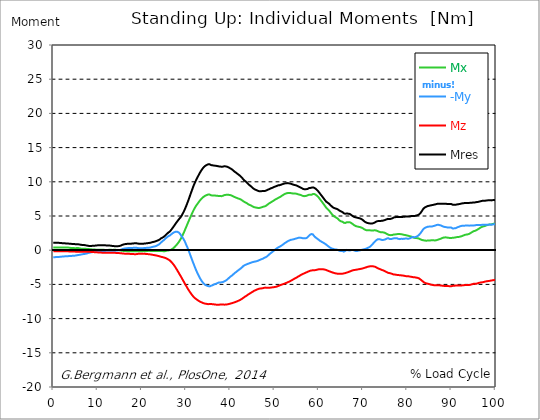
| Category |  Mx |  -My |  Mz |  Mres |
|---|---|---|---|---|
| 0.0 | 0.38 | -1.02 | -0.15 | 1.1 |
| 0.167348456675344 | 0.38 | -1.02 | -0.14 | 1.1 |
| 0.334696913350688 | 0.38 | -1.02 | -0.14 | 1.1 |
| 0.5020453700260321 | 0.4 | -1.01 | -0.15 | 1.1 |
| 0.669393826701376 | 0.41 | -1 | -0.15 | 1.1 |
| 0.83674228337672 | 0.42 | -0.99 | -0.15 | 1.09 |
| 1.0040907400520642 | 0.41 | -0.98 | -0.15 | 1.08 |
| 1.1621420602454444 | 0.39 | -0.99 | -0.15 | 1.08 |
| 1.3294905169207885 | 0.38 | -0.98 | -0.16 | 1.07 |
| 1.4968389735961325 | 0.37 | -0.97 | -0.16 | 1.06 |
| 1.6641874302714765 | 0.38 | -0.96 | -0.16 | 1.05 |
| 1.8315358869468206 | 0.39 | -0.95 | -0.16 | 1.04 |
| 1.9988843436221646 | 0.4 | -0.93 | -0.16 | 1.03 |
| 2.1662328002975086 | 0.4 | -0.92 | -0.16 | 1.02 |
| 2.333581256972853 | 0.39 | -0.92 | -0.16 | 1.01 |
| 2.5009297136481967 | 0.38 | -0.91 | -0.16 | 1 |
| 2.6682781703235405 | 0.4 | -0.89 | -0.16 | 1 |
| 2.8356266269988843 | 0.4 | -0.89 | -0.17 | 0.99 |
| 3.002975083674229 | 0.38 | -0.89 | -0.17 | 0.98 |
| 3.1703235403495724 | 0.37 | -0.88 | -0.17 | 0.98 |
| 3.337671997024917 | 0.38 | -0.87 | -0.17 | 0.97 |
| 3.4957233172182973 | 0.38 | -0.86 | -0.17 | 0.96 |
| 3.663071773893641 | 0.37 | -0.85 | -0.18 | 0.95 |
| 3.8304202305689854 | 0.34 | -0.85 | -0.19 | 0.94 |
| 3.997768687244329 | 0.31 | -0.85 | -0.19 | 0.93 |
| 4.165117143919673 | 0.32 | -0.83 | -0.19 | 0.92 |
| 4.332465600595017 | 0.33 | -0.82 | -0.19 | 0.91 |
| 4.499814057270361 | 0.33 | -0.81 | -0.2 | 0.9 |
| 4.667162513945706 | 0.31 | -0.8 | -0.2 | 0.9 |
| 4.834510970621049 | 0.3 | -0.8 | -0.21 | 0.89 |
| 5.001859427296393 | 0.29 | -0.79 | -0.21 | 0.88 |
| 5.169207883971737 | 0.29 | -0.77 | -0.21 | 0.87 |
| 5.336556340647081 | 0.32 | -0.74 | -0.22 | 0.86 |
| 5.503904797322425 | 0.31 | -0.72 | -0.23 | 0.85 |
| 5.671253253997769 | 0.31 | -0.7 | -0.23 | 0.86 |
| 5.82930457419115 | 0.29 | -0.69 | -0.24 | 0.85 |
| 5.996653030866494 | 0.26 | -0.67 | -0.24 | 0.82 |
| 6.164001487541838 | 0.24 | -0.64 | -0.23 | 0.8 |
| 6.331349944217181 | 0.22 | -0.62 | -0.23 | 0.78 |
| 6.498698400892526 | 0.22 | -0.59 | -0.23 | 0.77 |
| 6.66604685756787 | 0.22 | -0.58 | -0.23 | 0.77 |
| 6.833395314243213 | 0.22 | -0.57 | -0.23 | 0.77 |
| 7.000743770918558 | 0.22 | -0.55 | -0.23 | 0.75 |
| 7.168092227593902 | 0.22 | -0.53 | -0.23 | 0.73 |
| 7.335440684269246 | 0.2 | -0.51 | -0.23 | 0.71 |
| 7.50278914094459 | 0.19 | -0.48 | -0.23 | 0.69 |
| 7.6701375976199335 | 0.18 | -0.46 | -0.23 | 0.67 |
| 7.837486054295278 | 0.17 | -0.43 | -0.24 | 0.65 |
| 7.995537374488658 | 0.17 | -0.39 | -0.24 | 0.63 |
| 8.162885831164003 | 0.16 | -0.36 | -0.24 | 0.62 |
| 8.330234287839346 | 0.14 | -0.34 | -0.24 | 0.62 |
| 8.49758274451469 | 0.12 | -0.32 | -0.25 | 0.62 |
| 8.664931201190035 | 0.12 | -0.3 | -0.26 | 0.63 |
| 8.832279657865378 | 0.12 | -0.27 | -0.26 | 0.64 |
| 8.999628114540721 | 0.12 | -0.26 | -0.27 | 0.65 |
| 9.166976571216066 | 0.12 | -0.24 | -0.28 | 0.66 |
| 9.334325027891412 | 0.11 | -0.23 | -0.29 | 0.66 |
| 9.501673484566755 | 0.09 | -0.21 | -0.29 | 0.67 |
| 9.669021941242098 | 0.06 | -0.2 | -0.3 | 0.69 |
| 9.836370397917442 | 0.08 | -0.17 | -0.31 | 0.7 |
| 10.003718854592787 | 0.08 | -0.16 | -0.32 | 0.71 |
| 10.17106731126813 | 0.08 | -0.15 | -0.32 | 0.71 |
| 10.329118631461512 | 0.07 | -0.15 | -0.33 | 0.72 |
| 10.496467088136853 | 0.07 | -0.14 | -0.34 | 0.73 |
| 10.663815544812199 | 0.06 | -0.12 | -0.34 | 0.74 |
| 10.831164001487544 | 0.07 | -0.11 | -0.35 | 0.75 |
| 10.998512458162887 | 0.07 | -0.1 | -0.36 | 0.74 |
| 11.16586091483823 | 0.07 | -0.1 | -0.36 | 0.73 |
| 11.333209371513574 | 0.06 | -0.11 | -0.36 | 0.72 |
| 11.50055782818892 | 0.05 | -0.11 | -0.36 | 0.71 |
| 11.667906284864264 | 0.04 | -0.11 | -0.36 | 0.71 |
| 11.835254741539607 | 0.03 | -0.1 | -0.36 | 0.71 |
| 12.00260319821495 | 0.04 | -0.09 | -0.36 | 0.7 |
| 12.169951654890292 | 0.05 | -0.08 | -0.37 | 0.7 |
| 12.337300111565641 | 0.04 | -0.09 | -0.37 | 0.69 |
| 12.504648568240984 | 0.05 | -0.09 | -0.36 | 0.69 |
| 12.662699888434362 | 0.06 | -0.09 | -0.36 | 0.68 |
| 12.830048345109708 | 0.07 | -0.08 | -0.37 | 0.67 |
| 12.997396801785053 | 0.07 | -0.09 | -0.37 | 0.66 |
| 13.164745258460396 | 0.04 | -0.09 | -0.37 | 0.64 |
| 13.33209371513574 | 0.03 | -0.09 | -0.37 | 0.62 |
| 13.499442171811083 | 0.05 | -0.1 | -0.37 | 0.61 |
| 13.666790628486426 | 0.07 | -0.09 | -0.37 | 0.6 |
| 13.834139085161771 | 0.08 | -0.08 | -0.38 | 0.59 |
| 14.001487541837117 | 0.06 | -0.08 | -0.39 | 0.58 |
| 14.16883599851246 | 0.04 | -0.07 | -0.39 | 0.57 |
| 14.336184455187803 | 0.03 | -0.05 | -0.4 | 0.57 |
| 14.503532911863147 | 0.03 | -0.03 | -0.4 | 0.58 |
| 14.670881368538492 | 0.04 | -0.03 | -0.41 | 0.59 |
| 14.828932688731873 | 0.01 | -0.01 | -0.42 | 0.6 |
| 14.996281145407215 | -0.01 | 0.01 | -0.43 | 0.62 |
| 15.163629602082558 | -0.03 | 0.04 | -0.44 | 0.66 |
| 15.330978058757903 | -0.06 | 0.09 | -0.45 | 0.7 |
| 15.498326515433247 | -0.06 | 0.12 | -0.46 | 0.73 |
| 15.665674972108594 | -0.08 | 0.19 | -0.48 | 0.8 |
| 15.833023428783937 | -0.11 | 0.22 | -0.49 | 0.84 |
| 16.00037188545928 | -0.13 | 0.23 | -0.5 | 0.86 |
| 16.167720342134626 | -0.13 | 0.25 | -0.5 | 0.88 |
| 16.335068798809967 | -0.13 | 0.27 | -0.51 | 0.9 |
| 16.502417255485312 | -0.14 | 0.28 | -0.52 | 0.91 |
| 16.669765712160658 | -0.14 | 0.3 | -0.52 | 0.93 |
| 16.837114168836 | -0.14 | 0.31 | -0.53 | 0.93 |
| 17.004462625511344 | -0.16 | 0.31 | -0.53 | 0.94 |
| 17.16251394570472 | -0.16 | 0.33 | -0.53 | 0.95 |
| 17.32986240238007 | -0.14 | 0.34 | -0.54 | 0.96 |
| 17.497210859055414 | -0.15 | 0.34 | -0.55 | 0.96 |
| 17.664559315730756 | -0.16 | 0.33 | -0.55 | 0.96 |
| 17.8319077724061 | -0.17 | 0.33 | -0.55 | 0.97 |
| 17.999256229081443 | -0.17 | 0.34 | -0.56 | 0.98 |
| 18.166604685756788 | -0.16 | 0.35 | -0.57 | 0.99 |
| 18.333953142432133 | -0.17 | 0.36 | -0.58 | 1.01 |
| 18.501301599107478 | -0.17 | 0.37 | -0.59 | 1.02 |
| 18.668650055782823 | -0.17 | 0.36 | -0.58 | 1.01 |
| 18.835998512458165 | -0.17 | 0.34 | -0.57 | 1 |
| 19.00334696913351 | -0.17 | 0.33 | -0.55 | 0.99 |
| 19.170695425808855 | -0.16 | 0.31 | -0.54 | 0.97 |
| 19.338043882484197 | -0.17 | 0.29 | -0.52 | 0.95 |
| 19.496095202677576 | -0.16 | 0.29 | -0.52 | 0.95 |
| 19.66344365935292 | -0.15 | 0.29 | -0.52 | 0.94 |
| 19.830792116028263 | -0.16 | 0.29 | -0.51 | 0.94 |
| 19.998140572703612 | -0.15 | 0.29 | -0.51 | 0.95 |
| 20.165489029378953 | -0.14 | 0.29 | -0.51 | 0.95 |
| 20.3328374860543 | -0.13 | 0.3 | -0.51 | 0.95 |
| 20.500185942729644 | -0.13 | 0.32 | -0.52 | 0.96 |
| 20.667534399404985 | -0.14 | 0.33 | -0.53 | 0.98 |
| 20.83488285608033 | -0.16 | 0.33 | -0.54 | 0.98 |
| 21.002231312755672 | -0.14 | 0.34 | -0.55 | 1 |
| 21.16957976943102 | -0.12 | 0.35 | -0.56 | 1.02 |
| 21.336928226106362 | -0.11 | 0.36 | -0.57 | 1.03 |
| 21.504276682781704 | -0.1 | 0.36 | -0.58 | 1.05 |
| 21.67162513945705 | -0.09 | 0.37 | -0.59 | 1.06 |
| 21.82967645965043 | -0.11 | 0.38 | -0.61 | 1.08 |
| 21.997024916325774 | -0.12 | 0.4 | -0.62 | 1.1 |
| 22.16437337300112 | -0.12 | 0.44 | -0.64 | 1.14 |
| 22.33172182967646 | -0.1 | 0.47 | -0.66 | 1.17 |
| 22.499070286351806 | -0.09 | 0.5 | -0.68 | 1.2 |
| 22.666418743027148 | -0.1 | 0.52 | -0.7 | 1.22 |
| 22.833767199702496 | -0.1 | 0.54 | -0.72 | 1.25 |
| 23.00111565637784 | -0.1 | 0.56 | -0.74 | 1.27 |
| 23.168464113053183 | -0.11 | 0.6 | -0.76 | 1.32 |
| 23.335812569728528 | -0.1 | 0.65 | -0.78 | 1.36 |
| 23.50316102640387 | -0.1 | 0.7 | -0.81 | 1.4 |
| 23.670509483079215 | -0.1 | 0.77 | -0.84 | 1.44 |
| 23.83785793975456 | -0.11 | 0.81 | -0.86 | 1.47 |
| 23.995909259947936 | -0.13 | 0.9 | -0.89 | 1.54 |
| 24.163257716623285 | -0.13 | 1 | -0.92 | 1.62 |
| 24.330606173298627 | -0.13 | 1.12 | -0.96 | 1.73 |
| 24.49795462997397 | -0.12 | 1.21 | -0.99 | 1.79 |
| 24.665303086649313 | -0.13 | 1.31 | -1.01 | 1.84 |
| 24.83265154332466 | -0.15 | 1.41 | -1.04 | 1.92 |
| 25.0 | -0.16 | 1.49 | -1.07 | 1.98 |
| 25.167348456675345 | -0.16 | 1.6 | -1.11 | 2.08 |
| 25.334696913350694 | -0.13 | 1.69 | -1.14 | 2.16 |
| 25.502045370026035 | -0.1 | 1.79 | -1.18 | 2.27 |
| 25.669393826701377 | -0.07 | 1.89 | -1.23 | 2.38 |
| 25.836742283376722 | -0.06 | 1.97 | -1.29 | 2.47 |
| 26.004090740052067 | -0.04 | 2.05 | -1.36 | 2.58 |
| 26.17143919672741 | -0.03 | 2.11 | -1.43 | 2.66 |
| 26.329490516920792 | -0.01 | 2.15 | -1.5 | 2.73 |
| 26.49683897359613 | 0.03 | 2.23 | -1.6 | 2.85 |
| 26.66418743027148 | 0.09 | 2.33 | -1.71 | 2.99 |
| 26.831535886946828 | 0.15 | 2.42 | -1.83 | 3.13 |
| 26.998884343622166 | 0.23 | 2.5 | -1.96 | 3.29 |
| 27.166232800297514 | 0.31 | 2.58 | -2.1 | 3.44 |
| 27.333581256972852 | 0.41 | 2.62 | -2.24 | 3.59 |
| 27.5009297136482 | 0.52 | 2.68 | -2.4 | 3.75 |
| 27.668278170323543 | 0.64 | 2.71 | -2.58 | 3.91 |
| 27.835626626998888 | 0.76 | 2.72 | -2.75 | 4.05 |
| 28.002975083674233 | 0.89 | 2.71 | -2.92 | 4.19 |
| 28.170323540349575 | 1.02 | 2.65 | -3.11 | 4.34 |
| 28.33767199702492 | 1.17 | 2.59 | -3.29 | 4.48 |
| 28.50502045370026 | 1.34 | 2.49 | -3.48 | 4.62 |
| 28.663071773893645 | 1.51 | 2.37 | -3.66 | 4.75 |
| 28.830420230568986 | 1.69 | 2.21 | -3.84 | 4.87 |
| 28.99776868724433 | 1.89 | 2.04 | -4.03 | 5.03 |
| 29.165117143919673 | 2.11 | 1.91 | -4.23 | 5.25 |
| 29.33246560059502 | 2.35 | 1.74 | -4.43 | 5.45 |
| 29.499814057270367 | 2.58 | 1.54 | -4.61 | 5.66 |
| 29.66716251394571 | 2.82 | 1.35 | -4.81 | 5.89 |
| 29.834510970621054 | 3.09 | 1.12 | -5.01 | 6.15 |
| 30.00185942729639 | 3.34 | 0.85 | -5.19 | 6.4 |
| 30.169207883971744 | 3.6 | 0.61 | -5.37 | 6.68 |
| 30.33655634064708 | 3.86 | 0.36 | -5.56 | 6.97 |
| 30.50390479732243 | 4.11 | 0.09 | -5.74 | 7.25 |
| 30.671253253997772 | 4.36 | -0.18 | -5.91 | 7.55 |
| 30.829304574191156 | 4.61 | -0.48 | -6.07 | 7.86 |
| 30.996653030866494 | 4.86 | -0.78 | -6.23 | 8.17 |
| 31.164001487541842 | 5.1 | -1.07 | -6.38 | 8.47 |
| 31.331349944217187 | 5.35 | -1.36 | -6.53 | 8.77 |
| 31.498698400892525 | 5.58 | -1.65 | -6.67 | 9.07 |
| 31.666046857567874 | 5.8 | -1.93 | -6.79 | 9.36 |
| 31.833395314243212 | 6.01 | -2.2 | -6.9 | 9.62 |
| 32.00074377091856 | 6.21 | -2.48 | -7 | 9.87 |
| 32.1680922275939 | 6.39 | -2.75 | -7.09 | 10.1 |
| 32.33544068426925 | 6.55 | -3 | -7.17 | 10.32 |
| 32.50278914094459 | 6.69 | -3.25 | -7.25 | 10.54 |
| 32.670137597619934 | 6.85 | -3.48 | -7.32 | 10.75 |
| 32.83748605429528 | 7 | -3.7 | -7.39 | 10.96 |
| 33.004834510970625 | 7.15 | -3.9 | -7.46 | 11.16 |
| 33.162885831164004 | 7.29 | -4.1 | -7.52 | 11.36 |
| 33.33023428783935 | 7.41 | -4.3 | -7.57 | 11.54 |
| 33.497582744514695 | 7.53 | -4.47 | -7.62 | 11.71 |
| 33.664931201190036 | 7.64 | -4.62 | -7.67 | 11.87 |
| 33.83227965786538 | 7.73 | -4.76 | -7.72 | 12.01 |
| 33.99962811454073 | 7.82 | -4.88 | -7.76 | 12.14 |
| 34.16697657121607 | 7.9 | -4.97 | -7.78 | 12.24 |
| 34.33432502789141 | 7.96 | -5.07 | -7.81 | 12.33 |
| 34.50167348456676 | 8.02 | -5.14 | -7.83 | 12.41 |
| 34.6690219412421 | 8.06 | -5.17 | -7.85 | 12.46 |
| 34.83637039791744 | 8.11 | -5.2 | -7.88 | 12.52 |
| 35.00371885459279 | 8.14 | -5.25 | -7.89 | 12.56 |
| 35.17106731126814 | 8.15 | -5.27 | -7.89 | 12.58 |
| 35.338415767943474 | 8.13 | -5.29 | -7.86 | 12.56 |
| 35.49646708813686 | 8.08 | -5.25 | -7.85 | 12.5 |
| 35.6638155448122 | 8.03 | -5.19 | -7.86 | 12.44 |
| 35.831164001487544 | 7.98 | -5.12 | -7.89 | 12.4 |
| 35.998512458162885 | 7.98 | -5.12 | -7.9 | 12.41 |
| 36.165860914838234 | 7.97 | -5.08 | -7.91 | 12.39 |
| 36.333209371513576 | 7.98 | -5.01 | -7.92 | 12.37 |
| 36.50055782818892 | 7.98 | -4.96 | -7.93 | 12.35 |
| 36.667906284864266 | 7.98 | -4.93 | -7.95 | 12.35 |
| 36.83525474153961 | 7.97 | -4.89 | -7.96 | 12.33 |
| 37.002603198214956 | 7.96 | -4.84 | -7.97 | 12.31 |
| 37.1699516548903 | 7.95 | -4.78 | -7.99 | 12.29 |
| 37.337300111565646 | 7.93 | -4.74 | -7.99 | 12.26 |
| 37.50464856824098 | 7.91 | -4.74 | -7.97 | 12.25 |
| 37.66269988843437 | 7.92 | -4.73 | -7.95 | 12.24 |
| 37.83004834510971 | 7.91 | -4.72 | -7.94 | 12.22 |
| 37.99739680178505 | 7.9 | -4.69 | -7.93 | 12.2 |
| 38.16474525846039 | 7.92 | -4.67 | -7.94 | 12.2 |
| 38.33209371513574 | 7.96 | -4.65 | -7.95 | 12.22 |
| 38.49944217181109 | 8 | -4.6 | -7.95 | 12.24 |
| 38.666790628486424 | 8.05 | -4.55 | -7.96 | 12.27 |
| 38.83413908516178 | 8.08 | -4.5 | -7.96 | 12.28 |
| 39.001487541837115 | 8.09 | -4.44 | -7.95 | 12.25 |
| 39.16883599851246 | 8.11 | -4.36 | -7.94 | 12.23 |
| 39.336184455187805 | 8.11 | -4.27 | -7.92 | 12.19 |
| 39.503532911863154 | 8.09 | -4.18 | -7.9 | 12.14 |
| 39.670881368538495 | 8.09 | -4.08 | -7.87 | 12.09 |
| 39.83822982521384 | 8.09 | -3.97 | -7.84 | 12.04 |
| 39.996281145407224 | 8.06 | -3.87 | -7.81 | 11.96 |
| 40.163629602082565 | 8.02 | -3.8 | -7.78 | 11.9 |
| 40.33097805875791 | 7.98 | -3.73 | -7.75 | 11.84 |
| 40.498326515433256 | 7.91 | -3.64 | -7.73 | 11.74 |
| 40.6656749721086 | 7.87 | -3.54 | -7.69 | 11.66 |
| 40.83302342878393 | 7.82 | -3.44 | -7.65 | 11.57 |
| 41.00037188545929 | 7.77 | -3.34 | -7.61 | 11.47 |
| 41.16772034213463 | 7.73 | -3.26 | -7.58 | 11.4 |
| 41.33506879880997 | 7.68 | -3.19 | -7.53 | 11.32 |
| 41.50241725548531 | 7.64 | -3.11 | -7.48 | 11.24 |
| 41.66976571216066 | 7.59 | -3.01 | -7.44 | 11.15 |
| 41.837114168836 | 7.54 | -2.94 | -7.39 | 11.07 |
| 42.004462625511344 | 7.52 | -2.85 | -7.34 | 10.99 |
| 42.17181108218669 | 7.47 | -2.77 | -7.28 | 10.9 |
| 42.32986240238007 | 7.43 | -2.68 | -7.23 | 10.81 |
| 42.497210859055414 | 7.37 | -2.59 | -7.17 | 10.71 |
| 42.66455931573076 | 7.3 | -2.5 | -7.1 | 10.59 |
| 42.831907772406105 | 7.21 | -2.39 | -7.02 | 10.44 |
| 42.999256229081446 | 7.13 | -2.29 | -6.94 | 10.31 |
| 43.16660468575679 | 7.07 | -2.22 | -6.86 | 10.2 |
| 43.33395314243214 | 7.01 | -2.17 | -6.79 | 10.11 |
| 43.50130159910748 | 6.96 | -2.13 | -6.73 | 10.04 |
| 43.66865005578282 | 6.91 | -2.07 | -6.66 | 9.94 |
| 43.83599851245817 | 6.83 | -2.04 | -6.58 | 9.83 |
| 44.00334696913351 | 6.75 | -1.99 | -6.5 | 9.71 |
| 44.17069542580886 | 6.69 | -1.95 | -6.43 | 9.61 |
| 44.3380438824842 | 6.63 | -1.91 | -6.37 | 9.52 |
| 44.49609520267758 | 6.59 | -1.87 | -6.3 | 9.43 |
| 44.66344365935292 | 6.54 | -1.83 | -6.23 | 9.35 |
| 44.83079211602827 | 6.49 | -1.78 | -6.17 | 9.26 |
| 44.99814057270361 | 6.42 | -1.75 | -6.1 | 9.15 |
| 45.16548902937895 | 6.35 | -1.73 | -6.02 | 9.05 |
| 45.332837486054295 | 6.3 | -1.7 | -5.96 | 8.97 |
| 45.500185942729644 | 6.26 | -1.67 | -5.91 | 8.9 |
| 45.66753439940499 | 6.25 | -1.65 | -5.86 | 8.86 |
| 45.83488285608033 | 6.23 | -1.63 | -5.8 | 8.81 |
| 46.00223131275568 | 6.21 | -1.6 | -5.76 | 8.76 |
| 46.16957976943102 | 6.18 | -1.56 | -5.71 | 8.7 |
| 46.336928226106366 | 6.17 | -1.52 | -5.67 | 8.66 |
| 46.50427668278171 | 6.17 | -1.47 | -5.64 | 8.63 |
| 46.671625139457056 | 6.19 | -1.42 | -5.61 | 8.62 |
| 46.829676459650436 | 6.22 | -1.38 | -5.6 | 8.62 |
| 46.99702491632577 | 6.25 | -1.33 | -5.59 | 8.63 |
| 47.16437337300112 | 6.29 | -1.29 | -5.58 | 8.64 |
| 47.33172182967646 | 6.33 | -1.25 | -5.56 | 8.65 |
| 47.49907028635181 | 6.36 | -1.19 | -5.54 | 8.65 |
| 47.66641874302716 | 6.39 | -1.13 | -5.5 | 8.65 |
| 47.83376719970249 | 6.42 | -1.09 | -5.48 | 8.66 |
| 48.001115656377834 | 6.46 | -1.03 | -5.47 | 8.68 |
| 48.16846411305319 | 6.54 | -0.97 | -5.47 | 8.73 |
| 48.33581256972853 | 6.62 | -0.9 | -5.48 | 8.78 |
| 48.50316102640387 | 6.71 | -0.8 | -5.49 | 8.84 |
| 48.67050948307921 | 6.79 | -0.7 | -5.49 | 8.89 |
| 48.837857939754564 | 6.86 | -0.6 | -5.48 | 8.94 |
| 49.005206396429905 | 6.93 | -0.5 | -5.48 | 8.98 |
| 49.163257716623285 | 7 | -0.41 | -5.47 | 9.04 |
| 49.33060617329863 | 7.06 | -0.34 | -5.45 | 9.08 |
| 49.49795462997397 | 7.12 | -0.26 | -5.44 | 9.12 |
| 49.66530308664932 | 7.19 | -0.17 | -5.42 | 9.17 |
| 49.832651543324666 | 7.26 | -0.09 | -5.4 | 9.22 |
| 50.0 | 7.33 | 0 | -5.39 | 9.26 |
| 50.16734845667534 | 7.4 | 0.09 | -5.37 | 9.31 |
| 50.33469691335069 | 7.47 | 0.18 | -5.35 | 9.36 |
| 50.50204537002604 | 7.52 | 0.27 | -5.32 | 9.39 |
| 50.66939382670139 | 7.58 | 0.34 | -5.28 | 9.44 |
| 50.836742283376715 | 7.64 | 0.41 | -5.24 | 9.48 |
| 51.00409074005207 | 7.7 | 0.47 | -5.19 | 9.49 |
| 51.17143919672741 | 7.75 | 0.52 | -5.14 | 9.51 |
| 51.32949051692079 | 7.81 | 0.57 | -5.1 | 9.54 |
| 51.496838973596134 | 7.89 | 0.63 | -5.06 | 9.58 |
| 51.66418743027148 | 7.96 | 0.71 | -5.02 | 9.62 |
| 51.831535886946824 | 8.03 | 0.78 | -4.99 | 9.66 |
| 51.99888434362217 | 8.1 | 0.87 | -4.95 | 9.7 |
| 52.16623280029752 | 8.16 | 0.96 | -4.91 | 9.73 |
| 52.33358125697285 | 8.22 | 1.04 | -4.87 | 9.76 |
| 52.5009297136482 | 8.27 | 1.11 | -4.82 | 9.78 |
| 52.668278170323546 | 8.31 | 1.17 | -4.78 | 9.8 |
| 52.835626626998895 | 8.34 | 1.25 | -4.73 | 9.81 |
| 53.00297508367424 | 8.36 | 1.32 | -4.69 | 9.8 |
| 53.17032354034958 | 8.36 | 1.37 | -4.64 | 9.79 |
| 53.33767199702492 | 8.37 | 1.42 | -4.59 | 9.77 |
| 53.50502045370027 | 8.36 | 1.47 | -4.54 | 9.75 |
| 53.663071773893655 | 8.35 | 1.51 | -4.48 | 9.72 |
| 53.83042023056899 | 8.34 | 1.54 | -4.42 | 9.68 |
| 53.99776868724433 | 8.31 | 1.55 | -4.36 | 9.64 |
| 54.16511714391967 | 8.3 | 1.58 | -4.3 | 9.6 |
| 54.33246560059503 | 8.28 | 1.6 | -4.23 | 9.57 |
| 54.49981405727037 | 8.28 | 1.65 | -4.17 | 9.54 |
| 54.667162513945705 | 8.28 | 1.67 | -4.11 | 9.51 |
| 54.834510970621054 | 8.28 | 1.71 | -4.06 | 9.49 |
| 55.0018594272964 | 8.26 | 1.73 | -4 | 9.45 |
| 55.169207883971744 | 8.22 | 1.76 | -3.93 | 9.4 |
| 55.336556340647086 | 8.17 | 1.8 | -3.86 | 9.34 |
| 55.50390479732243 | 8.15 | 1.82 | -3.8 | 9.29 |
| 55.671253253997776 | 8.12 | 1.84 | -3.74 | 9.24 |
| 55.83860171067312 | 8.09 | 1.84 | -3.67 | 9.19 |
| 55.9966530308665 | 8.06 | 1.82 | -3.61 | 9.14 |
| 56.16400148754184 | 8 | 1.8 | -3.55 | 9.07 |
| 56.33134994421718 | 7.95 | 1.76 | -3.5 | 8.99 |
| 56.498698400892536 | 7.92 | 1.74 | -3.44 | 8.95 |
| 56.66604685756788 | 7.9 | 1.73 | -3.4 | 8.92 |
| 56.83339531424321 | 7.9 | 1.74 | -3.35 | 8.9 |
| 57.00074377091856 | 7.92 | 1.74 | -3.3 | 8.91 |
| 57.16809222759391 | 7.95 | 1.75 | -3.26 | 8.92 |
| 57.33544068426925 | 7.98 | 1.8 | -3.21 | 8.93 |
| 57.5027891409446 | 8.02 | 1.89 | -3.16 | 8.96 |
| 57.670137597619934 | 8.08 | 2.03 | -3.11 | 9.02 |
| 57.83748605429528 | 8.14 | 2.16 | -3.07 | 9.09 |
| 58.004834510970625 | 8.12 | 2.24 | -3.02 | 9.09 |
| 58.16288583116401 | 8.13 | 2.32 | -2.99 | 9.11 |
| 58.330234287839346 | 8.1 | 2.36 | -2.96 | 9.09 |
| 58.497582744514695 | 8.18 | 2.38 | -2.96 | 9.17 |
| 58.66493120119004 | 8.21 | 2.32 | -2.94 | 9.19 |
| 58.832279657865385 | 8.24 | 2.2 | -2.93 | 9.17 |
| 58.999628114540734 | 8.22 | 2.04 | -2.94 | 9.13 |
| 59.16697657121607 | 8.17 | 1.9 | -2.93 | 9.06 |
| 59.33432502789142 | 8.1 | 1.84 | -2.9 | 8.97 |
| 59.50167348456676 | 8.02 | 1.76 | -2.87 | 8.87 |
| 59.66902194124211 | 7.92 | 1.68 | -2.84 | 8.76 |
| 59.83637039791745 | 7.82 | 1.61 | -2.8 | 8.65 |
| 60.00371885459278 | 7.7 | 1.52 | -2.79 | 8.52 |
| 60.17106731126813 | 7.56 | 1.42 | -2.79 | 8.38 |
| 60.33841576794349 | 7.41 | 1.35 | -2.78 | 8.23 |
| 60.49646708813685 | 7.27 | 1.29 | -2.77 | 8.09 |
| 60.6638155448122 | 7.13 | 1.23 | -2.78 | 7.96 |
| 60.831164001487544 | 6.99 | 1.18 | -2.78 | 7.82 |
| 60.99851245816289 | 6.84 | 1.11 | -2.79 | 7.67 |
| 61.16586091483824 | 6.69 | 1.04 | -2.8 | 7.53 |
| 61.333209371513576 | 6.54 | 0.98 | -2.83 | 7.39 |
| 61.50055782818892 | 6.39 | 0.91 | -2.86 | 7.26 |
| 61.667906284864266 | 6.23 | 0.83 | -2.89 | 7.11 |
| 61.835254741539615 | 6.11 | 0.75 | -2.93 | 7.01 |
| 62.002603198214956 | 6.02 | 0.65 | -2.98 | 6.96 |
| 62.16995165489029 | 5.93 | 0.55 | -3.04 | 6.9 |
| 62.33730011156564 | 5.81 | 0.49 | -3.07 | 6.8 |
| 62.504648568240995 | 5.67 | 0.4 | -3.12 | 6.7 |
| 62.67199702491633 | 5.52 | 0.34 | -3.15 | 6.58 |
| 62.83004834510971 | 5.38 | 0.28 | -3.19 | 6.46 |
| 62.99739680178505 | 5.25 | 0.24 | -3.23 | 6.37 |
| 63.1647452584604 | 5.12 | 0.2 | -3.26 | 6.27 |
| 63.33209371513575 | 5.01 | 0.17 | -3.3 | 6.21 |
| 63.4994421718111 | 4.94 | 0.14 | -3.33 | 6.17 |
| 63.666790628486424 | 4.87 | 0.11 | -3.37 | 6.12 |
| 63.83413908516177 | 4.81 | 0.1 | -3.39 | 6.09 |
| 64.00148754183712 | 4.75 | 0.09 | -3.41 | 6.06 |
| 64.16883599851248 | 4.69 | 0.08 | -3.42 | 6.03 |
| 64.3361844551878 | 4.6 | 0.04 | -3.44 | 5.97 |
| 64.50353291186315 | 4.47 | -0.02 | -3.45 | 5.88 |
| 64.6708813685385 | 4.36 | -0.07 | -3.46 | 5.79 |
| 64.83822982521384 | 4.28 | -0.11 | -3.47 | 5.73 |
| 65.00557828188919 | 4.23 | -0.11 | -3.46 | 5.68 |
| 65.16362960208257 | 4.23 | -0.08 | -3.46 | 5.66 |
| 65.3309780587579 | 4.17 | -0.1 | -3.44 | 5.59 |
| 65.49832651543326 | 4.09 | -0.17 | -3.41 | 5.49 |
| 65.6656749721086 | 4.02 | -0.21 | -3.39 | 5.4 |
| 65.83302342878395 | 3.97 | -0.19 | -3.36 | 5.34 |
| 66.00037188545929 | 3.97 | -0.1 | -3.35 | 5.33 |
| 66.16772034213463 | 4.03 | 0.01 | -3.31 | 5.36 |
| 66.33506879880998 | 4.08 | 0.04 | -3.27 | 5.38 |
| 66.50241725548531 | 4.12 | 0 | -3.23 | 5.38 |
| 66.66976571216065 | 4.09 | -0.02 | -3.2 | 5.34 |
| 66.83711416883601 | 4.11 | -0.06 | -3.16 | 5.33 |
| 67.00446262551135 | 4.1 | -0.05 | -3.12 | 5.3 |
| 67.1718110821867 | 4.06 | -0.02 | -3.08 | 5.24 |
| 67.32986240238007 | 3.99 | 0.01 | -3.03 | 5.16 |
| 67.49721085905541 | 3.91 | 0.02 | -2.98 | 5.07 |
| 67.66455931573076 | 3.83 | 0.03 | -2.95 | 4.99 |
| 67.83190777240611 | 3.74 | 0.02 | -2.92 | 4.92 |
| 67.99925622908145 | 3.66 | -0.02 | -2.9 | 4.87 |
| 68.16660468575678 | 3.6 | -0.07 | -2.88 | 4.83 |
| 68.33395314243214 | 3.54 | -0.11 | -2.87 | 4.81 |
| 68.50130159910749 | 3.5 | -0.13 | -2.85 | 4.79 |
| 68.66865005578282 | 3.47 | -0.12 | -2.83 | 4.76 |
| 68.83599851245816 | 3.44 | -0.09 | -2.81 | 4.73 |
| 69.00334696913352 | 3.42 | -0.06 | -2.79 | 4.7 |
| 69.17069542580886 | 3.4 | -0.04 | -2.77 | 4.67 |
| 69.3380438824842 | 3.38 | -0.02 | -2.75 | 4.65 |
| 69.50539233915956 | 3.34 | 0 | -2.73 | 4.6 |
| 69.66344365935292 | 3.3 | 0.04 | -2.71 | 4.54 |
| 69.83079211602826 | 3.26 | 0.08 | -2.68 | 4.49 |
| 69.99814057270362 | 3.19 | 0.1 | -2.65 | 4.4 |
| 70.16548902937896 | 3.12 | 0.13 | -2.62 | 4.31 |
| 70.33283748605429 | 3.04 | 0.15 | -2.58 | 4.2 |
| 70.50018594272964 | 2.99 | 0.19 | -2.55 | 4.13 |
| 70.667534399405 | 2.94 | 0.21 | -2.52 | 4.07 |
| 70.83488285608033 | 2.92 | 0.26 | -2.47 | 4.01 |
| 71.00223131275568 | 2.9 | 0.31 | -2.44 | 3.98 |
| 71.16957976943102 | 2.9 | 0.36 | -2.41 | 3.96 |
| 71.33692822610637 | 2.9 | 0.41 | -2.38 | 3.94 |
| 71.50427668278171 | 2.9 | 0.46 | -2.37 | 3.92 |
| 71.67162513945706 | 2.9 | 0.54 | -2.35 | 3.9 |
| 71.8389735961324 | 2.9 | 0.64 | -2.34 | 3.88 |
| 71.99702491632577 | 2.89 | 0.76 | -2.34 | 3.89 |
| 72.16437337300113 | 2.89 | 0.87 | -2.35 | 3.9 |
| 72.33172182967647 | 2.89 | 1 | -2.36 | 3.95 |
| 72.49907028635181 | 2.9 | 1.13 | -2.38 | 4 |
| 72.66641874302715 | 2.91 | 1.24 | -2.41 | 4.05 |
| 72.8337671997025 | 2.9 | 1.35 | -2.45 | 4.11 |
| 73.00111565637783 | 2.88 | 1.46 | -2.51 | 4.18 |
| 73.16846411305319 | 2.84 | 1.54 | -2.57 | 4.23 |
| 73.33581256972853 | 2.79 | 1.59 | -2.63 | 4.25 |
| 73.50316102640387 | 2.74 | 1.58 | -2.69 | 4.26 |
| 73.67050948307921 | 2.7 | 1.61 | -2.72 | 4.27 |
| 73.83785793975457 | 2.66 | 1.6 | -2.76 | 4.27 |
| 74.00520639642991 | 2.63 | 1.57 | -2.81 | 4.28 |
| 74.16325771662328 | 2.62 | 1.53 | -2.86 | 4.29 |
| 74.33060617329863 | 2.62 | 1.48 | -2.9 | 4.3 |
| 74.49795462997398 | 2.62 | 1.46 | -2.94 | 4.31 |
| 74.66530308664932 | 2.6 | 1.51 | -2.97 | 4.35 |
| 74.83265154332466 | 2.57 | 1.53 | -3.02 | 4.38 |
| 75.00000000000001 | 2.53 | 1.57 | -3.08 | 4.42 |
| 75.16734845667534 | 2.48 | 1.61 | -3.13 | 4.45 |
| 75.3346969133507 | 2.4 | 1.68 | -3.2 | 4.51 |
| 75.50204537002605 | 2.34 | 1.72 | -3.27 | 4.56 |
| 75.66939382670138 | 2.29 | 1.76 | -3.3 | 4.58 |
| 75.83674228337672 | 2.24 | 1.72 | -3.33 | 4.57 |
| 76.00409074005208 | 2.21 | 1.65 | -3.35 | 4.55 |
| 76.17143919672742 | 2.2 | 1.6 | -3.37 | 4.54 |
| 76.33878765340276 | 2.2 | 1.62 | -3.4 | 4.59 |
| 76.49683897359614 | 2.2 | 1.66 | -3.44 | 4.63 |
| 76.66418743027148 | 2.22 | 1.68 | -3.48 | 4.67 |
| 76.83153588694682 | 2.26 | 1.71 | -3.52 | 4.74 |
| 76.99888434362218 | 2.31 | 1.74 | -3.56 | 4.79 |
| 77.16623280029752 | 2.32 | 1.73 | -3.57 | 4.8 |
| 77.33358125697285 | 2.31 | 1.75 | -3.57 | 4.83 |
| 77.5009297136482 | 2.32 | 1.76 | -3.59 | 4.84 |
| 77.66827817032356 | 2.34 | 1.75 | -3.61 | 4.86 |
| 77.83562662699889 | 2.37 | 1.71 | -3.63 | 4.87 |
| 78.00297508367423 | 2.38 | 1.66 | -3.64 | 4.87 |
| 78.17032354034959 | 2.37 | 1.63 | -3.64 | 4.86 |
| 78.33767199702493 | 2.36 | 1.62 | -3.65 | 4.86 |
| 78.50502045370027 | 2.34 | 1.65 | -3.66 | 4.86 |
| 78.67236891037561 | 2.34 | 1.67 | -3.68 | 4.87 |
| 78.83042023056899 | 2.32 | 1.67 | -3.69 | 4.88 |
| 78.99776868724433 | 2.29 | 1.65 | -3.7 | 4.87 |
| 79.16511714391969 | 2.25 | 1.65 | -3.71 | 4.86 |
| 79.33246560059503 | 2.24 | 1.67 | -3.74 | 4.88 |
| 79.49981405727036 | 2.22 | 1.7 | -3.77 | 4.91 |
| 79.66716251394571 | 2.2 | 1.72 | -3.79 | 4.93 |
| 79.83451097062107 | 2.18 | 1.71 | -3.8 | 4.93 |
| 80.00185942729641 | 2.15 | 1.69 | -3.81 | 4.93 |
| 80.16920788397174 | 2.12 | 1.67 | -3.81 | 4.91 |
| 80.33655634064709 | 2.09 | 1.68 | -3.82 | 4.91 |
| 80.50390479732243 | 2.05 | 1.72 | -3.85 | 4.93 |
| 80.67125325399778 | 2.03 | 1.76 | -3.86 | 4.94 |
| 80.83860171067312 | 2.01 | 1.82 | -3.88 | 4.98 |
| 80.99665303086651 | 1.97 | 1.87 | -3.9 | 5 |
| 81.16400148754184 | 1.92 | 1.89 | -3.92 | 5 |
| 81.3313499442172 | 1.86 | 1.93 | -3.94 | 5.01 |
| 81.49869840089255 | 1.83 | 1.9 | -3.94 | 5 |
| 81.66604685756786 | 1.8 | 1.88 | -3.95 | 4.99 |
| 81.83339531424322 | 1.78 | 1.9 | -3.97 | 5.02 |
| 82.00074377091858 | 1.77 | 1.95 | -4 | 5.06 |
| 82.16809222759392 | 1.76 | 2.01 | -4.03 | 5.09 |
| 82.33544068426926 | 1.76 | 2.06 | -4.04 | 5.12 |
| 82.50278914094459 | 1.74 | 2.13 | -4.07 | 5.16 |
| 82.67013759761994 | 1.7 | 2.23 | -4.12 | 5.22 |
| 82.83748605429528 | 1.65 | 2.34 | -4.18 | 5.31 |
| 83.00483451097062 | 1.58 | 2.48 | -4.27 | 5.42 |
| 83.17218296764597 | 1.54 | 2.61 | -4.35 | 5.55 |
| 83.33023428783935 | 1.5 | 2.78 | -4.45 | 5.73 |
| 83.4975827445147 | 1.47 | 2.94 | -4.55 | 5.91 |
| 83.66493120119004 | 1.45 | 3.09 | -4.64 | 6.07 |
| 83.83227965786537 | 1.44 | 3.19 | -4.71 | 6.18 |
| 83.99962811454073 | 1.41 | 3.26 | -4.77 | 6.26 |
| 84.16697657121607 | 1.39 | 3.31 | -4.83 | 6.32 |
| 84.33432502789142 | 1.39 | 3.36 | -4.85 | 6.36 |
| 84.50167348456677 | 1.4 | 3.41 | -4.87 | 6.42 |
| 84.6690219412421 | 1.41 | 3.44 | -4.9 | 6.46 |
| 84.83637039791745 | 1.41 | 3.45 | -4.93 | 6.48 |
| 85.0037188545928 | 1.41 | 3.45 | -4.96 | 6.5 |
| 85.17106731126813 | 1.42 | 3.45 | -5 | 6.54 |
| 85.33841576794349 | 1.44 | 3.46 | -5.03 | 6.56 |
| 85.50576422461883 | 1.46 | 3.47 | -5.05 | 6.59 |
| 85.66381554481221 | 1.46 | 3.48 | -5.07 | 6.6 |
| 85.83116400148755 | 1.46 | 3.5 | -5.09 | 6.62 |
| 85.99851245816289 | 1.44 | 3.54 | -5.11 | 6.65 |
| 86.16586091483823 | 1.42 | 3.55 | -5.12 | 6.66 |
| 86.33320937151358 | 1.43 | 3.6 | -5.12 | 6.69 |
| 86.50055782818893 | 1.45 | 3.65 | -5.13 | 6.73 |
| 86.66790628486427 | 1.47 | 3.69 | -5.14 | 6.76 |
| 86.83525474153961 | 1.5 | 3.72 | -5.13 | 6.79 |
| 87.00260319821496 | 1.55 | 3.72 | -5.13 | 6.8 |
| 87.16995165489031 | 1.59 | 3.69 | -5.13 | 6.8 |
| 87.33730011156564 | 1.62 | 3.67 | -5.14 | 6.79 |
| 87.504648568241 | 1.63 | 3.66 | -5.15 | 6.81 |
| 87.67199702491634 | 1.69 | 3.61 | -5.17 | 6.8 |
| 87.83004834510972 | 1.76 | 3.55 | -5.18 | 6.79 |
| 87.99739680178506 | 1.8 | 3.5 | -5.19 | 6.79 |
| 88.1647452584604 | 1.84 | 3.45 | -5.2 | 6.78 |
| 88.33209371513574 | 1.86 | 3.42 | -5.22 | 6.78 |
| 88.49944217181108 | 1.87 | 3.39 | -5.22 | 6.78 |
| 88.66679062848644 | 1.88 | 3.38 | -5.23 | 6.78 |
| 88.83413908516178 | 1.88 | 3.36 | -5.24 | 6.78 |
| 89.00148754183712 | 1.85 | 3.34 | -5.24 | 6.77 |
| 89.16883599851246 | 1.83 | 3.32 | -5.24 | 6.76 |
| 89.33618445518782 | 1.81 | 3.31 | -5.25 | 6.75 |
| 89.50353291186315 | 1.8 | 3.32 | -5.26 | 6.75 |
| 89.6708813685385 | 1.79 | 3.32 | -5.26 | 6.75 |
| 89.83822982521386 | 1.79 | 3.32 | -5.26 | 6.75 |
| 90.00557828188919 | 1.79 | 3.3 | -5.26 | 6.74 |
| 90.16362960208257 | 1.8 | 3.21 | -5.23 | 6.67 |
| 90.3309780587579 | 1.82 | 3.16 | -5.21 | 6.64 |
| 90.49832651543326 | 1.83 | 3.18 | -5.2 | 6.64 |
| 90.66567497210859 | 1.84 | 3.2 | -5.19 | 6.65 |
| 90.83302342878395 | 1.86 | 3.21 | -5.18 | 6.64 |
| 91.00037188545929 | 1.88 | 3.23 | -5.17 | 6.65 |
| 91.16772034213463 | 1.9 | 3.28 | -5.17 | 6.66 |
| 91.33506879880998 | 1.93 | 3.35 | -5.17 | 6.7 |
| 91.50241725548533 | 1.94 | 3.39 | -5.16 | 6.72 |
| 91.66976571216065 | 1.94 | 3.42 | -5.16 | 6.73 |
| 91.83711416883601 | 1.96 | 3.46 | -5.16 | 6.76 |
| 92.00446262551137 | 1.99 | 3.5 | -5.16 | 6.78 |
| 92.1718110821867 | 2.02 | 3.54 | -5.16 | 6.81 |
| 92.33915953886203 | 2.05 | 3.56 | -5.15 | 6.83 |
| 92.49721085905541 | 2.09 | 3.58 | -5.14 | 6.85 |
| 92.66455931573077 | 2.14 | 3.59 | -5.13 | 6.87 |
| 92.83190777240611 | 2.19 | 3.59 | -5.11 | 6.88 |
| 92.99925622908145 | 2.23 | 3.59 | -5.1 | 6.89 |
| 93.1666046857568 | 2.25 | 3.59 | -5.1 | 6.89 |
| 93.33395314243214 | 2.28 | 3.6 | -5.1 | 6.9 |
| 93.50130159910749 | 2.3 | 3.6 | -5.1 | 6.91 |
| 93.66865005578283 | 2.31 | 3.6 | -5.1 | 6.91 |
| 93.83599851245818 | 2.32 | 3.6 | -5.09 | 6.91 |
| 94.00334696913353 | 2.38 | 3.59 | -5.08 | 6.91 |
| 94.17069542580886 | 2.47 | 3.59 | -5.06 | 6.93 |
| 94.3380438824842 | 2.51 | 3.6 | -5.05 | 6.94 |
| 94.50539233915954 | 2.57 | 3.6 | -5.02 | 6.95 |
| 94.66344365935292 | 2.64 | 3.6 | -4.98 | 6.95 |
| 94.83079211602828 | 2.7 | 3.6 | -4.95 | 6.95 |
| 94.99814057270362 | 2.77 | 3.61 | -4.92 | 6.97 |
| 95.16548902937897 | 2.81 | 3.63 | -4.92 | 6.99 |
| 95.33283748605432 | 2.83 | 3.64 | -4.92 | 6.99 |
| 95.50018594272963 | 2.89 | 3.66 | -4.9 | 7.02 |
| 95.66753439940499 | 2.93 | 3.68 | -4.9 | 7.03 |
| 95.83488285608034 | 2.98 | 3.68 | -4.87 | 7.04 |
| 96.00223131275567 | 3.06 | 3.68 | -4.82 | 7.06 |
| 96.16957976943102 | 3.13 | 3.69 | -4.79 | 7.09 |
| 96.33692822610638 | 3.19 | 3.7 | -4.76 | 7.11 |
| 96.50427668278171 | 3.27 | 3.69 | -4.73 | 7.13 |
| 96.67162513945706 | 3.34 | 3.69 | -4.72 | 7.17 |
| 96.8389735961324 | 3.4 | 3.71 | -4.71 | 7.2 |
| 96.99702491632577 | 3.44 | 3.72 | -4.69 | 7.22 |
| 97.16437337300111 | 3.47 | 3.72 | -4.66 | 7.23 |
| 97.33172182967647 | 3.5 | 3.72 | -4.64 | 7.23 |
| 97.49907028635181 | 3.53 | 3.71 | -4.61 | 7.23 |
| 97.66641874302715 | 3.57 | 3.71 | -4.58 | 7.24 |
| 97.8337671997025 | 3.61 | 3.72 | -4.56 | 7.26 |
| 98.00111565637785 | 3.65 | 3.71 | -4.54 | 7.27 |
| 98.16846411305319 | 3.68 | 3.7 | -4.52 | 7.28 |
| 98.33581256972855 | 3.72 | 3.72 | -4.51 | 7.3 |
| 98.50316102640389 | 3.75 | 3.75 | -4.5 | 7.32 |
| 98.67050948307921 | 3.76 | 3.75 | -4.48 | 7.32 |
| 98.83785793975456 | 3.76 | 3.74 | -4.45 | 7.3 |
| 99.0052063964299 | 3.77 | 3.73 | -4.43 | 7.28 |
| 99.17255485310525 | 3.8 | 3.73 | -4.41 | 7.29 |
| 99.33060617329863 | 3.83 | 3.76 | -4.4 | 7.32 |
| 99.49795462997399 | 3.86 | 3.79 | -4.38 | 7.33 |
| 99.66530308664933 | 3.88 | 3.8 | -4.36 | 7.34 |
| 99.83265154332467 | 3.88 | 3.8 | -4.34 | 7.32 |
| 100.0 | 3.87 | 3.79 | -4.31 | 7.29 |